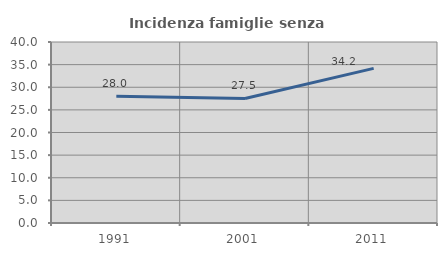
| Category | Incidenza famiglie senza nuclei |
|---|---|
| 1991.0 | 27.986 |
| 2001.0 | 27.531 |
| 2011.0 | 34.175 |